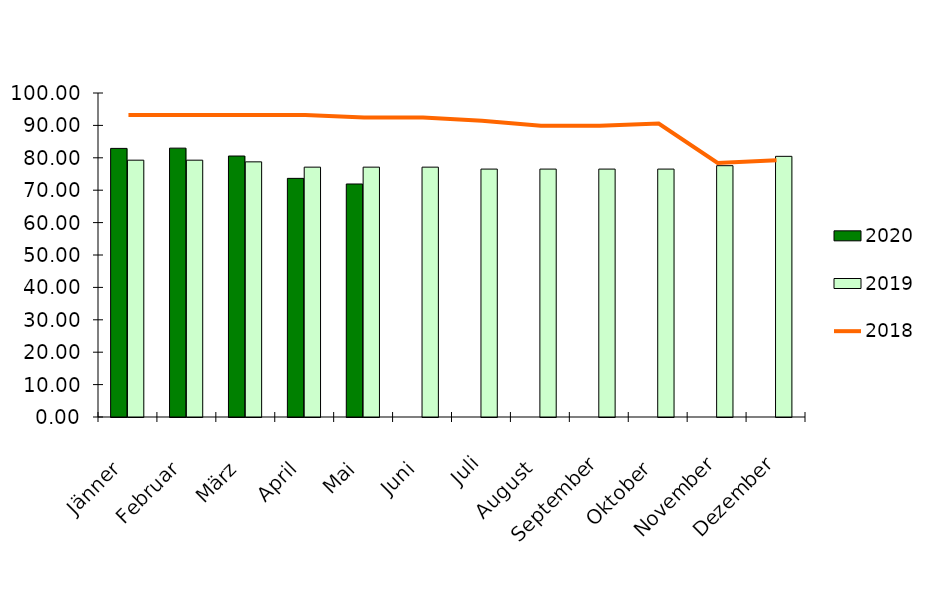
| Category | 2020 | 2019 |
|---|---|---|
| Jänner | 82.9 | 79.267 |
| Februar | 82.983 | 79.267 |
| März | 80.55 | 78.75 |
| April | 73.65 | 77.117 |
| Mai | 71.917 | 77.117 |
| Juni | 0 | 77.117 |
| Juli | 0 | 76.517 |
| August | 0 | 76.517 |
| September | 0 | 76.517 |
| Oktober | 0 | 76.517 |
| November | 0 | 77.567 |
| Dezember | 0 | 80.45 |